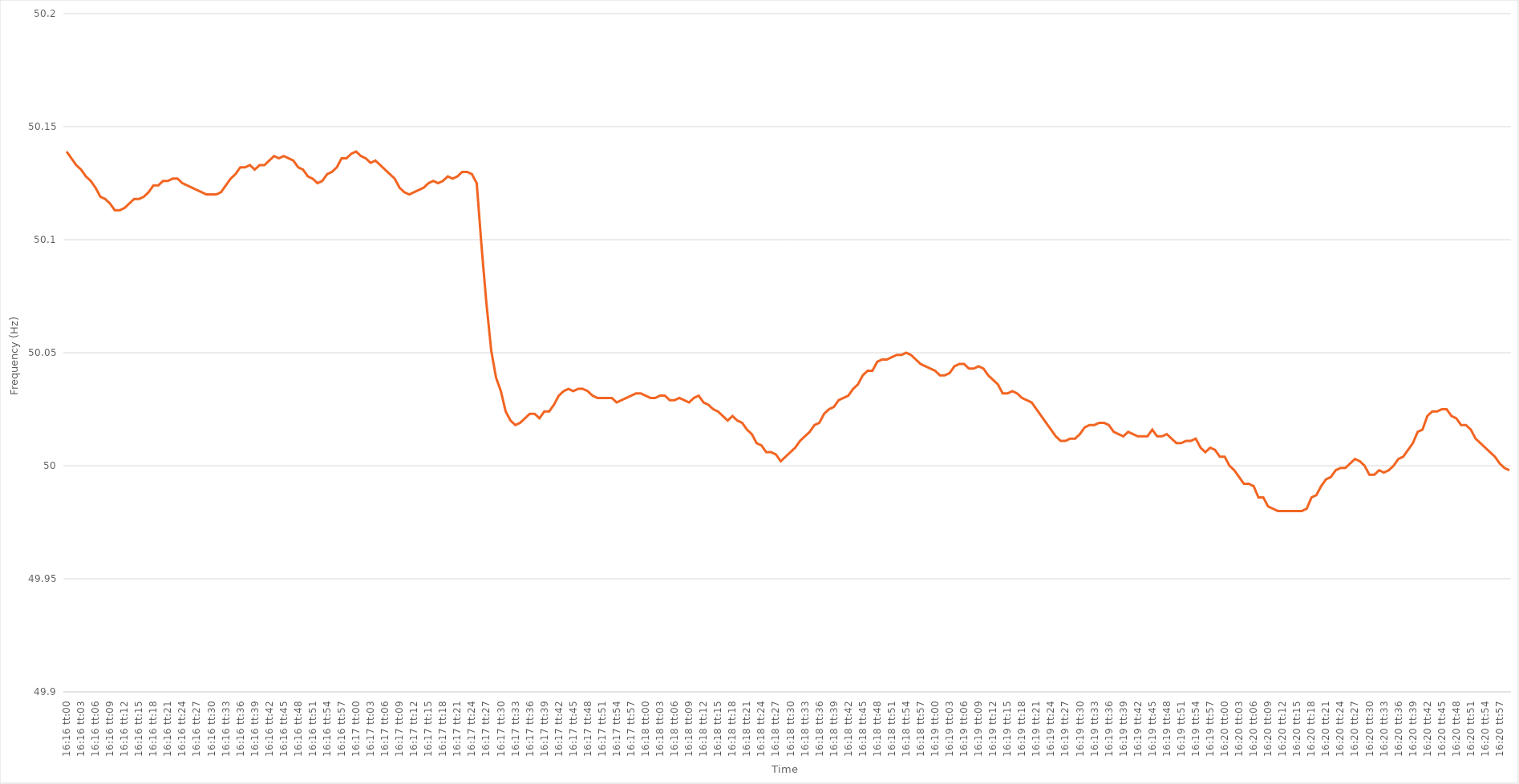
| Category | Series 0 |
|---|---|
| 0.6777777777777777 | 50.139 |
| 0.6777893518518519 | 50.136 |
| 0.677800925925926 | 50.133 |
| 0.6778124999999999 | 50.131 |
| 0.6778240740740741 | 50.128 |
| 0.6778356481481481 | 50.126 |
| 0.6778472222222223 | 50.123 |
| 0.6778587962962962 | 50.119 |
| 0.6778703703703703 | 50.118 |
| 0.6778819444444445 | 50.116 |
| 0.6778935185185185 | 50.113 |
| 0.6779050925925926 | 50.113 |
| 0.6779166666666666 | 50.114 |
| 0.6779282407407408 | 50.116 |
| 0.6779398148148149 | 50.118 |
| 0.6779513888888888 | 50.118 |
| 0.677962962962963 | 50.119 |
| 0.677974537037037 | 50.121 |
| 0.6779861111111112 | 50.124 |
| 0.6779976851851851 | 50.124 |
| 0.6780092592592593 | 50.126 |
| 0.6780208333333334 | 50.126 |
| 0.6780324074074073 | 50.127 |
| 0.6780439814814815 | 50.127 |
| 0.6780555555555555 | 50.125 |
| 0.6780671296296297 | 50.124 |
| 0.6780787037037036 | 50.123 |
| 0.6780902777777778 | 50.122 |
| 0.6781018518518519 | 50.121 |
| 0.6781134259259259 | 50.12 |
| 0.678125 | 50.12 |
| 0.678136574074074 | 50.12 |
| 0.6781481481481482 | 50.121 |
| 0.6781597222222223 | 50.124 |
| 0.6781712962962962 | 50.127 |
| 0.6781828703703704 | 50.129 |
| 0.6781944444444444 | 50.132 |
| 0.6782060185185186 | 50.132 |
| 0.6782175925925925 | 50.133 |
| 0.6782291666666667 | 50.131 |
| 0.6782407407407408 | 50.133 |
| 0.6782523148148148 | 50.133 |
| 0.6782638888888889 | 50.135 |
| 0.6782754629629629 | 50.137 |
| 0.6782870370370371 | 50.136 |
| 0.678298611111111 | 50.137 |
| 0.6783101851851852 | 50.136 |
| 0.6783217592592593 | 50.135 |
| 0.6783333333333333 | 50.132 |
| 0.6783449074074074 | 50.131 |
| 0.6783564814814814 | 50.128 |
| 0.6783680555555556 | 50.127 |
| 0.6783796296296297 | 50.125 |
| 0.6783912037037036 | 50.126 |
| 0.6784027777777778 | 50.129 |
| 0.6784143518518518 | 50.13 |
| 0.678425925925926 | 50.132 |
| 0.6784374999999999 | 50.136 |
| 0.6784490740740741 | 50.136 |
| 0.6784606481481482 | 50.138 |
| 0.6784722222222223 | 50.139 |
| 0.6784837962962963 | 50.137 |
| 0.6784953703703703 | 50.136 |
| 0.6785069444444445 | 50.134 |
| 0.6785185185185184 | 50.135 |
| 0.6785300925925926 | 50.133 |
| 0.6785416666666667 | 50.131 |
| 0.6785532407407407 | 50.129 |
| 0.6785648148148148 | 50.127 |
| 0.6785763888888888 | 50.123 |
| 0.678587962962963 | 50.121 |
| 0.6785995370370371 | 50.12 |
| 0.678611111111111 | 50.121 |
| 0.6786226851851852 | 50.122 |
| 0.6786342592592592 | 50.123 |
| 0.6786458333333334 | 50.125 |
| 0.6786574074074073 | 50.126 |
| 0.6786689814814815 | 50.125 |
| 0.6786805555555556 | 50.126 |
| 0.6786921296296297 | 50.128 |
| 0.6787037037037037 | 50.127 |
| 0.6787152777777777 | 50.128 |
| 0.6787268518518519 | 50.13 |
| 0.678738425925926 | 50.13 |
| 0.67875 | 50.129 |
| 0.6787615740740741 | 50.125 |
| 0.6787731481481482 | 50.097 |
| 0.6787847222222222 | 50.072 |
| 0.6787962962962962 | 50.051 |
| 0.6788078703703704 | 50.039 |
| 0.6788194444444445 | 50.033 |
| 0.6788310185185185 | 50.024 |
| 0.6788425925925926 | 50.02 |
| 0.6788541666666666 | 50.018 |
| 0.6788657407407408 | 50.019 |
| 0.6788773148148147 | 50.021 |
| 0.6788888888888889 | 50.023 |
| 0.678900462962963 | 50.023 |
| 0.6789120370370371 | 50.021 |
| 0.6789236111111111 | 50.024 |
| 0.6789351851851851 | 50.024 |
| 0.6789467592592593 | 50.027 |
| 0.6789583333333334 | 50.031 |
| 0.6789699074074074 | 50.033 |
| 0.6789814814814815 | 50.034 |
| 0.6789930555555556 | 50.033 |
| 0.6790046296296296 | 50.034 |
| 0.6790162037037036 | 50.034 |
| 0.6790277777777778 | 50.033 |
| 0.6790393518518519 | 50.031 |
| 0.6790509259259259 | 50.03 |
| 0.6790625 | 50.03 |
| 0.679074074074074 | 50.03 |
| 0.6790856481481482 | 50.03 |
| 0.6790972222222221 | 50.028 |
| 0.6791087962962963 | 50.029 |
| 0.6791203703703704 | 50.03 |
| 0.6791319444444445 | 50.031 |
| 0.6791435185185185 | 50.032 |
| 0.6791550925925925 | 50.032 |
| 0.6791666666666667 | 50.031 |
| 0.6791782407407408 | 50.03 |
| 0.6791898148148148 | 50.03 |
| 0.6792013888888889 | 50.031 |
| 0.679212962962963 | 50.031 |
| 0.679224537037037 | 50.029 |
| 0.679236111111111 | 50.029 |
| 0.6792476851851852 | 50.03 |
| 0.6792592592592593 | 50.029 |
| 0.6792708333333333 | 50.028 |
| 0.6792824074074074 | 50.03 |
| 0.6792939814814815 | 50.031 |
| 0.6793055555555556 | 50.028 |
| 0.6793171296296295 | 50.027 |
| 0.6793287037037037 | 50.025 |
| 0.6793402777777778 | 50.024 |
| 0.6793518518518519 | 50.022 |
| 0.6793634259259259 | 50.02 |
| 0.679375 | 50.022 |
| 0.6793865740740741 | 50.02 |
| 0.6793981481481483 | 50.019 |
| 0.6794097222222222 | 50.016 |
| 0.6794212962962963 | 50.014 |
| 0.6794328703703704 | 50.01 |
| 0.6794444444444444 | 50.009 |
| 0.6794560185185184 | 50.006 |
| 0.6794675925925926 | 50.006 |
| 0.6794791666666667 | 50.005 |
| 0.6794907407407407 | 50.002 |
| 0.6795023148148148 | 50.004 |
| 0.6795138888888889 | 50.006 |
| 0.679525462962963 | 50.008 |
| 0.6795370370370369 | 50.011 |
| 0.6795486111111111 | 50.013 |
| 0.6795601851851852 | 50.015 |
| 0.6795717592592593 | 50.018 |
| 0.6795833333333333 | 50.019 |
| 0.6795949074074074 | 50.023 |
| 0.6796064814814815 | 50.025 |
| 0.6796180555555557 | 50.026 |
| 0.6796296296296296 | 50.029 |
| 0.6796412037037037 | 50.03 |
| 0.6796527777777778 | 50.031 |
| 0.6796643518518519 | 50.034 |
| 0.6796759259259259 | 50.036 |
| 0.6796875 | 50.04 |
| 0.6796990740740741 | 50.042 |
| 0.6797106481481481 | 50.042 |
| 0.6797222222222222 | 50.046 |
| 0.6797337962962963 | 50.047 |
| 0.6797453703703704 | 50.047 |
| 0.6797569444444443 | 50.048 |
| 0.6797685185185185 | 50.049 |
| 0.6797800925925926 | 50.049 |
| 0.6797916666666667 | 50.05 |
| 0.6798032407407407 | 50.049 |
| 0.6798148148148148 | 50.047 |
| 0.6798263888888889 | 50.045 |
| 0.6798379629629631 | 50.044 |
| 0.679849537037037 | 50.043 |
| 0.6798611111111111 | 50.042 |
| 0.6798726851851852 | 50.04 |
| 0.6798842592592593 | 50.04 |
| 0.6798958333333333 | 50.041 |
| 0.6799074074074074 | 50.044 |
| 0.6799189814814816 | 50.045 |
| 0.6799305555555556 | 50.045 |
| 0.6799421296296296 | 50.043 |
| 0.6799537037037037 | 50.043 |
| 0.6799652777777778 | 50.044 |
| 0.6799768518518517 | 50.043 |
| 0.6799884259259259 | 50.04 |
| 0.68 | 50.038 |
| 0.6800115740740741 | 50.036 |
| 0.6800231481481481 | 50.032 |
| 0.6800347222222222 | 50.032 |
| 0.6800462962962963 | 50.033 |
| 0.6800578703703705 | 50.032 |
| 0.6800694444444444 | 50.03 |
| 0.6800810185185185 | 50.029 |
| 0.6800925925925926 | 50.028 |
| 0.6801041666666667 | 50.025 |
| 0.6801157407407407 | 50.022 |
| 0.6801273148148148 | 50.019 |
| 0.680138888888889 | 50.016 |
| 0.680150462962963 | 50.013 |
| 0.680162037037037 | 50.011 |
| 0.6801736111111111 | 50.011 |
| 0.6801851851851852 | 50.012 |
| 0.6801967592592592 | 50.012 |
| 0.6802083333333333 | 50.014 |
| 0.6802199074074075 | 50.017 |
| 0.6802314814814815 | 50.018 |
| 0.6802430555555555 | 50.018 |
| 0.6802546296296296 | 50.019 |
| 0.6802662037037037 | 50.019 |
| 0.6802777777777779 | 50.018 |
| 0.6802893518518518 | 50.015 |
| 0.680300925925926 | 50.014 |
| 0.6803125 | 50.013 |
| 0.6803240740740741 | 50.015 |
| 0.6803356481481481 | 50.014 |
| 0.6803472222222222 | 50.013 |
| 0.6803587962962964 | 50.013 |
| 0.6803703703703704 | 50.013 |
| 0.6803819444444444 | 50.016 |
| 0.6803935185185185 | 50.013 |
| 0.6804050925925926 | 50.013 |
| 0.6804166666666666 | 50.014 |
| 0.6804282407407407 | 50.012 |
| 0.6804398148148149 | 50.01 |
| 0.6804513888888889 | 50.01 |
| 0.6804629629629629 | 50.011 |
| 0.680474537037037 | 50.011 |
| 0.6804861111111111 | 50.012 |
| 0.6804976851851853 | 50.008 |
| 0.6805092592592592 | 50.006 |
| 0.6805208333333334 | 50.008 |
| 0.6805324074074074 | 50.007 |
| 0.6805439814814815 | 50.004 |
| 0.6805555555555555 | 50.004 |
| 0.6805671296296296 | 50 |
| 0.6805787037037038 | 49.998 |
| 0.6805902777777778 | 49.995 |
| 0.6806018518518518 | 49.992 |
| 0.6806134259259259 | 49.992 |
| 0.680625 | 49.991 |
| 0.680636574074074 | 49.986 |
| 0.6806481481481481 | 49.986 |
| 0.6806597222222223 | 49.982 |
| 0.6806712962962963 | 49.981 |
| 0.6806828703703703 | 49.98 |
| 0.6806944444444444 | 49.98 |
| 0.6807060185185185 | 49.98 |
| 0.6807175925925927 | 49.98 |
| 0.6807291666666666 | 49.98 |
| 0.6807407407407408 | 49.98 |
| 0.6807523148148148 | 49.981 |
| 0.680763888888889 | 49.986 |
| 0.6807754629629629 | 49.987 |
| 0.680787037037037 | 49.991 |
| 0.6807986111111112 | 49.994 |
| 0.6808101851851852 | 49.995 |
| 0.6808217592592593 | 49.998 |
| 0.6808333333333333 | 49.999 |
| 0.6808449074074074 | 49.999 |
| 0.6808564814814816 | 50.001 |
| 0.6808680555555555 | 50.003 |
| 0.6808796296296297 | 50.002 |
| 0.6808912037037037 | 50 |
| 0.6809027777777777 | 49.996 |
| 0.6809143518518518 | 49.996 |
| 0.6809259259259259 | 49.998 |
| 0.6809375000000001 | 49.997 |
| 0.680949074074074 | 49.998 |
| 0.6809606481481482 | 50 |
| 0.6809722222222222 | 50.003 |
| 0.6809837962962964 | 50.004 |
| 0.6809953703703703 | 50.007 |
| 0.6810069444444444 | 50.01 |
| 0.6810185185185186 | 50.015 |
| 0.6810300925925926 | 50.016 |
| 0.6810416666666667 | 50.022 |
| 0.6810532407407407 | 50.024 |
| 0.6810648148148148 | 50.024 |
| 0.681076388888889 | 50.025 |
| 0.6810879629629629 | 50.025 |
| 0.6810995370370371 | 50.022 |
| 0.6811111111111111 | 50.021 |
| 0.6811226851851852 | 50.018 |
| 0.6811342592592592 | 50.018 |
| 0.6811458333333333 | 50.016 |
| 0.6811574074074075 | 50.012 |
| 0.6811689814814814 | 50.01 |
| 0.6811805555555556 | 50.008 |
| 0.6811921296296296 | 50.006 |
| 0.6812037037037038 | 50.004 |
| 0.6812152777777777 | 50.001 |
| 0.6812268518518518 | 49.999 |
| 0.681238425925926 | 49.998 |